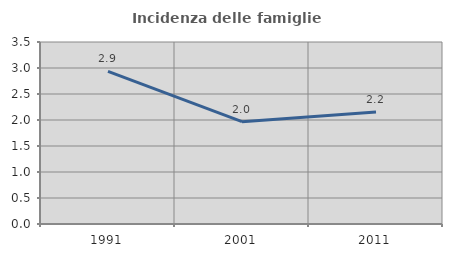
| Category | Incidenza delle famiglie numerose |
|---|---|
| 1991.0 | 2.935 |
| 2001.0 | 1.969 |
| 2011.0 | 2.152 |